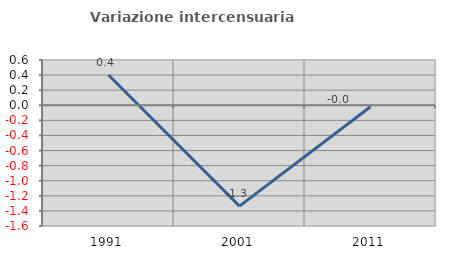
| Category | Variazione intercensuaria annua |
|---|---|
| 1991.0 | 0.401 |
| 2001.0 | -1.337 |
| 2011.0 | -0.02 |